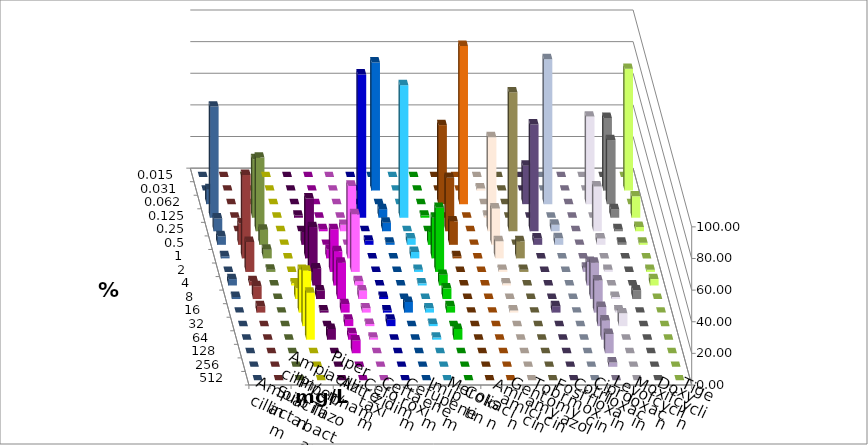
| Category | Ampicillin | Ampicillin/ Sulbactam | Piperacillin | Piperacillin/ Tazobactam | Aztreonam | Cefotaxim | Ceftazidim | Cefuroxim | Imipenem | Meropenem | Colistin | Amikacin | Gentamicin | Tobramycin | Fosfomycin | Cotrimoxazol | Ciprofloxacin | Levofloxacin | Moxifloxacin | Doxycyclin | Tigecyclin |
|---|---|---|---|---|---|---|---|---|---|---|---|---|---|---|---|---|---|---|---|---|---|
| 0.015 | 0 | 0 | 0 | 0 | 0 | 0 | 0 | 0 | 0 | 0 | 0 | 0 | 0 | 0 | 0 | 0 | 0 | 0 | 0 | 0 | 0 |
| 0.031 | 0 | 0 | 0 | 0 | 0 | 81.081 | 0 | 0 | 0 | 0 | 1.351 | 0 | 0 | 0 | 0 | 0 | 45.946 | 77.027 | 0 | 0 | 0 |
| 0.062 | 0 | 0 | 0 | 0 | 0 | 0 | 0 | 0 | 50 | 100 | 0 | 0 | 24.324 | 91.667 | 0 | 55.405 | 40.541 | 0 | 9.459 | 0 | 0 |
| 0.125 | 0 | 1.351 | 0 | 0 | 90.541 | 5.405 | 83.784 | 1.351 | 0 | 0 | 1.351 | 0 | 0 | 0 | 0 | 0 | 5.405 | 13.514 | 70.27 | 0 | 36.986 |
| 0.25 | 0 | 0 | 1.351 | 4.054 | 0 | 5.405 | 0 | 0 | 33.784 | 0 | 59.459 | 87.838 | 67.568 | 4.167 | 0 | 28.378 | 1.351 | 2.703 | 8.108 | 0 | 46.575 |
| 0.5 | 0 | 8.108 | 0 | 0 | 2.703 | 1.351 | 4.054 | 8.108 | 14.865 | 0 | 22.973 | 0 | 4.054 | 4.167 | 0 | 4.054 | 1.351 | 1.351 | 5.405 | 13.514 | 9.589 |
| 1.0 | 0 | 37.838 | 5.405 | 45.946 | 0 | 0 | 4.054 | 25.676 | 1.351 | 0 | 10.811 | 10.811 | 0 | 0 | 0 | 0 | 0 | 0 | 1.351 | 52.703 | 5.479 |
| 2.0 | 0 | 28.378 | 27.027 | 36.486 | 0 | 0 | 1.351 | 40.541 | 0 | 0 | 1.351 | 1.351 | 0 | 0 | 2.703 | 1.351 | 0 | 1.351 | 0 | 18.919 | 1.37 |
| 4.0 | 1.351 | 10.811 | 21.622 | 2.703 | 0 | 0 | 1.351 | 6.757 | 0 | 0 | 1.351 | 0 | 0 | 0 | 14.865 | 0 | 0 | 4.054 | 4.054 | 2.703 | 0 |
| 8.0 | 6.757 | 5.405 | 22.973 | 5.405 | 1.351 | 0 | 0 | 6.757 | 0 | 0 | 0 | 0 | 0 | 0 | 22.973 | 1.351 | 5.405 | 0 | 1.351 | 8.108 | 0 |
| 16.0 | 27.027 | 1.351 | 5.405 | 2.703 | 1.351 | 6.757 | 2.703 | 4.054 | 0 | 0 | 1.351 | 0 | 4.054 | 0 | 20.27 | 1.351 | 0 | 0 | 0 | 4.054 | 0 |
| 32.0 | 35.135 | 0 | 4.054 | 1.351 | 4.054 | 0 | 1.351 | 0 | 0 | 0 | 0 | 0 | 0 | 0 | 12.162 | 8.108 | 0 | 0 | 0 | 0 | 0 |
| 64.0 | 29.73 | 6.757 | 4.054 | 1.351 | 0 | 0 | 1.351 | 6.757 | 0 | 0 | 0 | 0 | 0 | 0 | 12.162 | 0 | 0 | 0 | 0 | 0 | 0 |
| 128.0 | 0 | 0 | 8.108 | 0 | 0 | 0 | 0 | 0 | 0 | 0 | 0 | 0 | 0 | 0 | 12.162 | 0 | 0 | 0 | 0 | 0 | 0 |
| 256.0 | 0 | 0 | 0 | 0 | 0 | 0 | 0 | 0 | 0 | 0 | 0 | 0 | 0 | 0 | 2.703 | 0 | 0 | 0 | 0 | 0 | 0 |
| 512.0 | 0 | 0 | 0 | 0 | 0 | 0 | 0 | 0 | 0 | 0 | 0 | 0 | 0 | 0 | 0 | 0 | 0 | 0 | 0 | 0 | 0 |